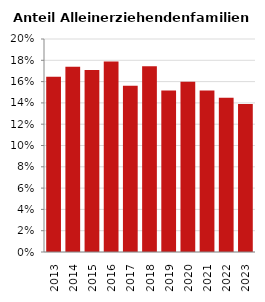
| Category | Anteil Alleinerziehende an Familien |
|---|---|
| 2013.0 | 0.165 |
| 2014.0 | 0.174 |
| 2015.0 | 0.171 |
| 2016.0 | 0.179 |
| 2017.0 | 0.156 |
| 2018.0 | 0.174 |
| 2019.0 | 0.152 |
| 2020.0 | 0.16 |
| 2021.0 | 0.152 |
| 2022.0 | 0.145 |
| 2023.0 | 0.139 |